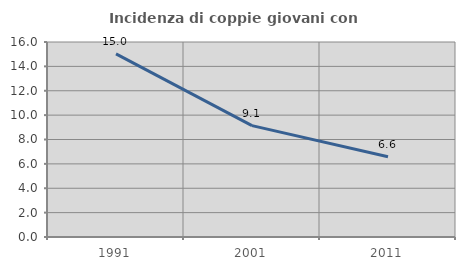
| Category | Incidenza di coppie giovani con figli |
|---|---|
| 1991.0 | 15.027 |
| 2001.0 | 9.138 |
| 2011.0 | 6.585 |